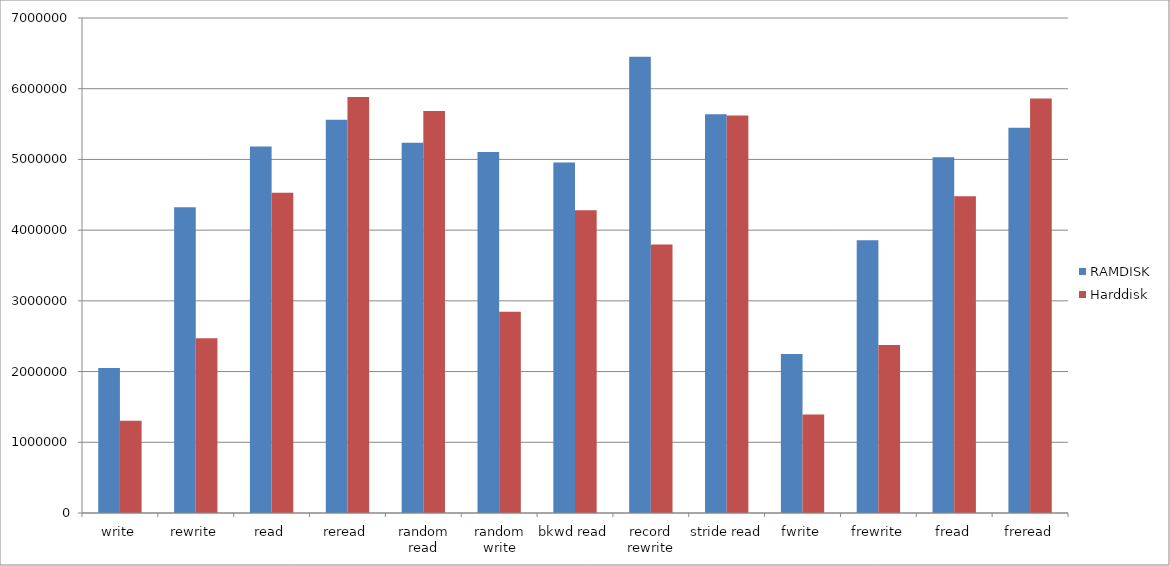
| Category | RAMDISK | Harddisk |
|---|---|---|
| write | 2049138.202 | 1304711.586 |
| rewrite | 4325106.374 | 2469892.808 |
| read | 5182684.677 | 4529466 |
| reread | 5562847.606 | 5884337.576 |
| random read | 5236944.172 | 5684602.919 |
| random write | 5103929.202 | 2845487.182 |
| bkwd read | 4955351.707 | 4282948.828 |
| record rewrite | 6453079.061 | 3798204.465 |
| stride read | 5639221.768 | 5620509.081 |
| fwrite | 2246909.515 | 1394460.101 |
| frewrite | 3858739.869 | 2375102.899 |
| fread | 5032293.899 | 4479272.687 |
| freread | 5449034.97 | 5860005.354 |